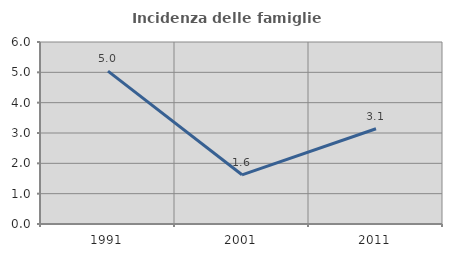
| Category | Incidenza delle famiglie numerose |
|---|---|
| 1991.0 | 5.04 |
| 2001.0 | 1.622 |
| 2011.0 | 3.14 |